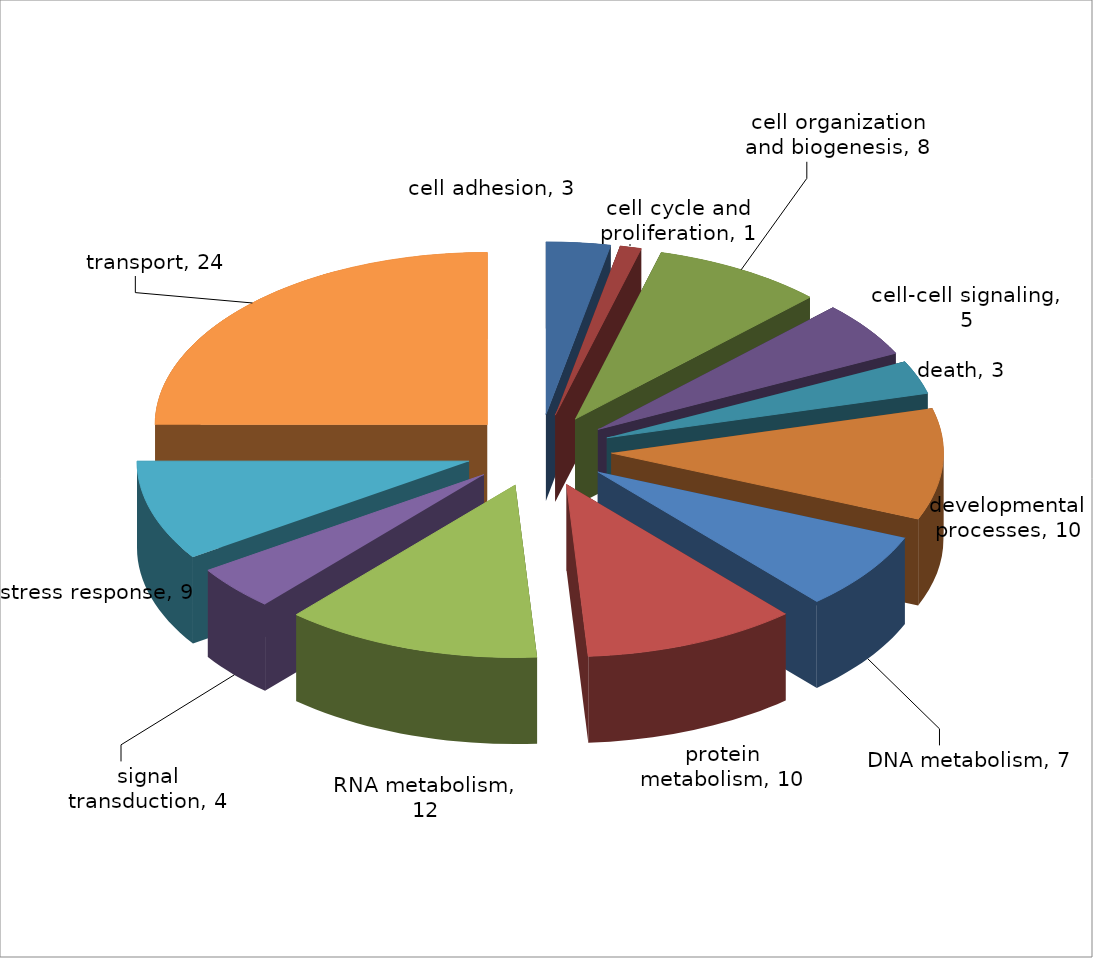
| Category | Series 0 |
|---|---|
| cell adhesion | 3 |
| cell cycle and proliferation | 1 |
| cell organization and biogenesis | 8 |
| cell-cell signaling | 5 |
| death | 3 |
| developmental processes | 10 |
| DNA metabolism | 7 |
| protein metabolism | 10 |
| RNA metabolism | 12 |
| signal transduction | 4 |
| stress response | 9 |
| transport | 24 |